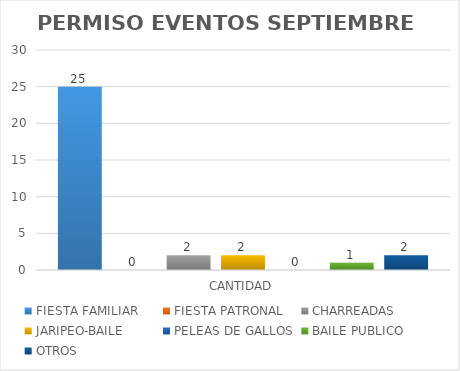
| Category | FIESTA FAMILIAR | FIESTA PATRONAL | CHARREADAS | JARIPEO-BAILE | PELEAS DE GALLOS | BAILE PUBLICO | OTROS |
|---|---|---|---|---|---|---|---|
| CANTIDAD | 25 | 0 | 2 | 2 | 0 | 1 | 2 |